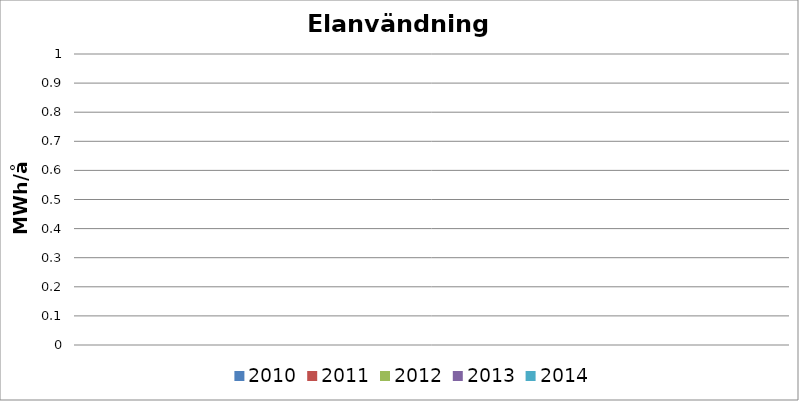
| Category | 2010 | 2011 | 2012 | 2013 | 2014 |
|---|---|---|---|---|---|
| 0 | 0 | 0 | 0 | 0 | 0 |